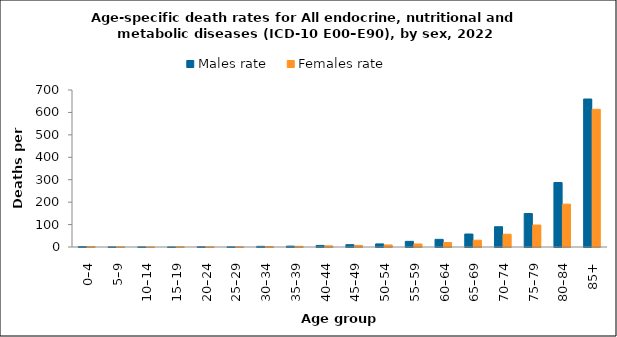
| Category | Males rate | Females rate |
|---|---|---|
| 0–4 | 2.059 | 1.495 |
| 5–9 | 0.603 | 0.511 |
| 10–14 | 0.594 | 0.126 |
| 15–19 | 0.379 | 0.673 |
| 20–24 | 1.064 | 0.632 |
| 25–29 | 0.865 | 0.665 |
| 30–34 | 2.955 | 2.066 |
| 35–39 | 3.935 | 2.935 |
| 40–44 | 7.009 | 4.982 |
| 45–49 | 10.335 | 6.956 |
| 50–54 | 13.761 | 9.169 |
| 55–59 | 25.181 | 13.457 |
| 60–64 | 34.182 | 19.82 |
| 65–69 | 57.865 | 30.194 |
| 70–74 | 90.354 | 56.927 |
| 75–79 | 149.282 | 97.98 |
| 80–84 | 287.376 | 191.03 |
| 85+ | 659.812 | 613.836 |